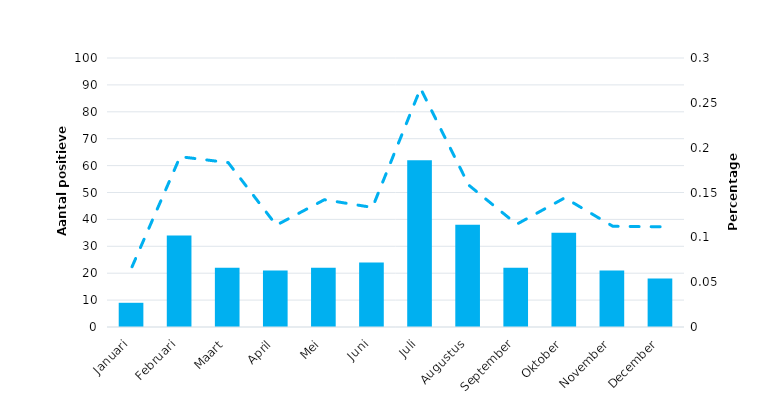
| Category | Series 2 |
|---|---|
| Januari | 9 |
| Februari | 34 |
| Maart | 22 |
| April | 21 |
| Mei | 22 |
| Juni | 24 |
| Juli | 62 |
| Augustus | 38 |
| September | 22 |
| Oktober | 35 |
| November | 21 |
| December | 18 |